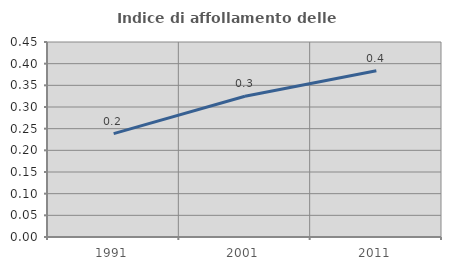
| Category | Indice di affollamento delle abitazioni  |
|---|---|
| 1991.0 | 0.239 |
| 2001.0 | 0.325 |
| 2011.0 | 0.384 |